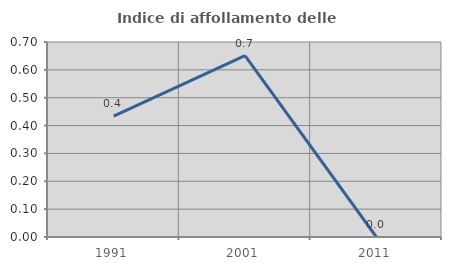
| Category | Indice di affollamento delle abitazioni  |
|---|---|
| 1991.0 | 0.434 |
| 2001.0 | 0.651 |
| 2011.0 | 0 |